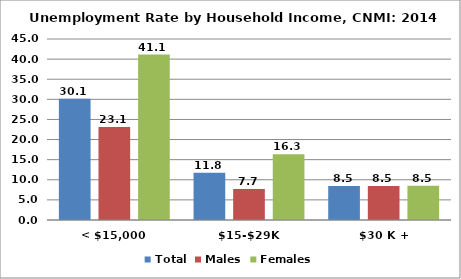
| Category | Total | Males | Females |
|---|---|---|---|
| < $15,000 | 30.135 | 23.132 | 41.145 |
| $15-$29K | 11.752 | 7.717 | 16.332 |
| $30 K + | 8.482 | 8.461 | 8.506 |